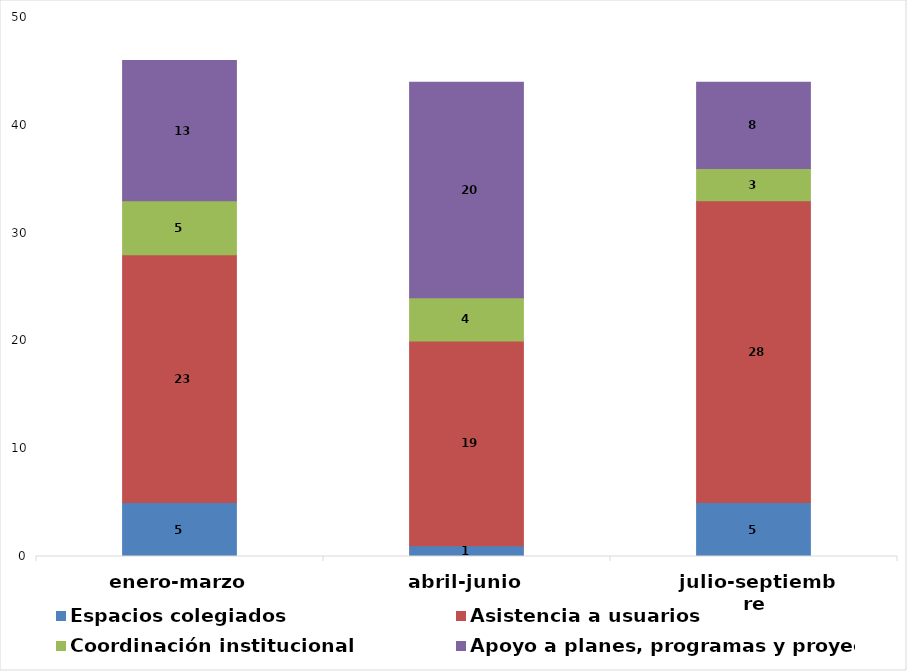
| Category | Espacios colegiados | Asistencia a usuarios  | Coordinación institucional  | Apoyo a planes, programas y proyectos |
|---|---|---|---|---|
| enero-marzo | 5 | 23 | 5 | 13 |
| abril-junio | 1 | 19 | 4 | 20 |
| julio-septiembre | 5 | 28 | 3 | 8 |